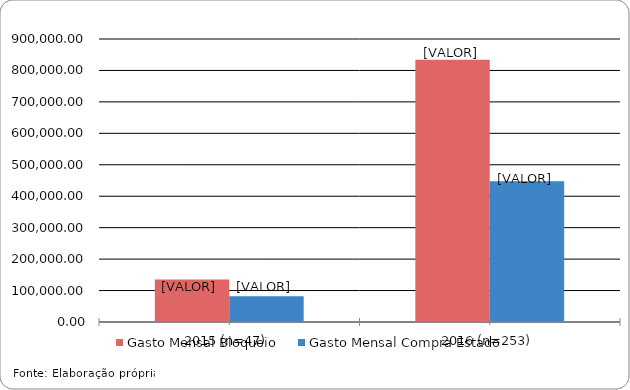
| Category | Gasto Mensal Bloqueio | Gasto Mensal Compra Estado |
|---|---|---|
| 2015 (n=47) | 135549.39 | 82016.29 |
| 2016 (n=253) | 833634.88 | 447357.68 |